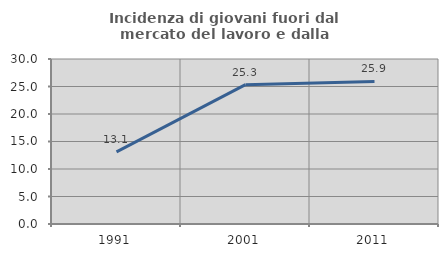
| Category | Incidenza di giovani fuori dal mercato del lavoro e dalla formazione  |
|---|---|
| 1991.0 | 13.115 |
| 2001.0 | 25.333 |
| 2011.0 | 25.926 |